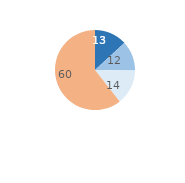
| Category | Series 0 |
|---|---|
| Importants | 13.096 |
| Assez importants | 12.035 |
| Peu importants | 14.105 |
| Pas de dégradations | 60.392 |